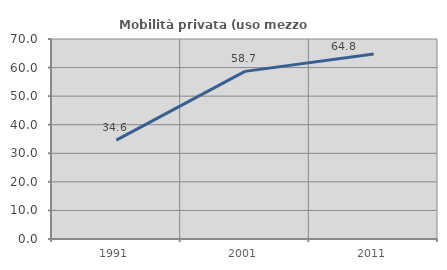
| Category | Mobilità privata (uso mezzo privato) |
|---|---|
| 1991.0 | 34.602 |
| 2001.0 | 58.669 |
| 2011.0 | 64.784 |